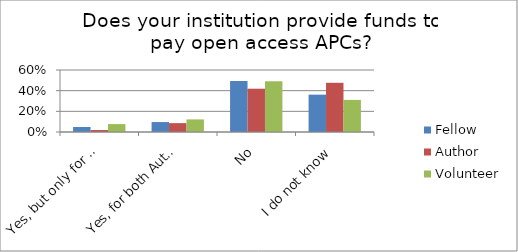
| Category | Fellow | Author | Volunteer |
|---|---|---|---|
| Yes, but only for Gold OA publications | 0.048 | 0.019 | 0.077 |
| Yes, for both Author-choice Hybrid OA and Gold OA publications | 0.096 | 0.086 | 0.122 |
| No | 0.494 | 0.419 | 0.491 |
| I do not know | 0.361 | 0.476 | 0.311 |